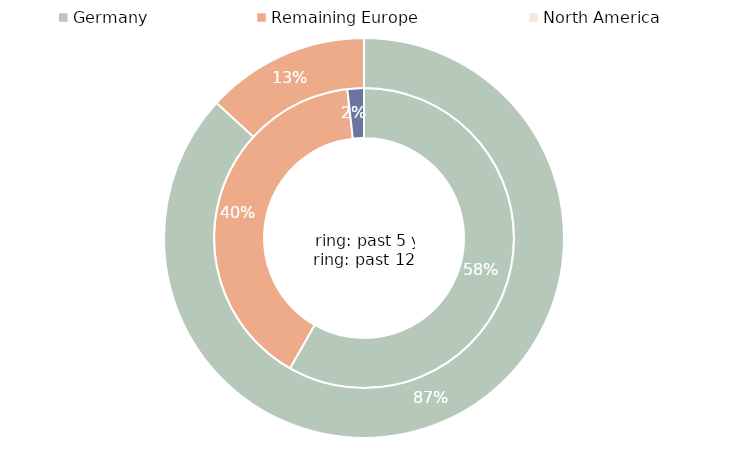
| Category | past 5 years | past 12 months |
|---|---|---|
| Germany | 1448617905.596 | 0.868 |
| Remaining Europe | 995104001.752 | 0.132 |
| North America | 44207086.064 | 0 |